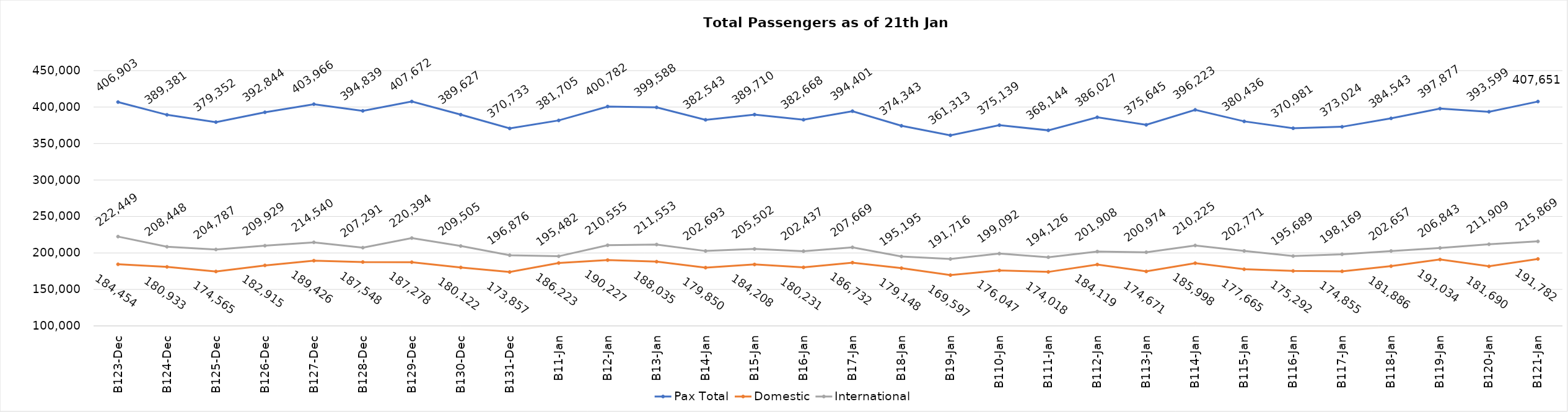
| Category | Pax Total | Domestic | International |
|---|---|---|---|
| 2023-12-23 | 406903 | 184454 | 222449 |
| 2023-12-24 | 389381 | 180933 | 208448 |
| 2023-12-25 | 379352 | 174565 | 204787 |
| 2023-12-26 | 392844 | 182915 | 209929 |
| 2023-12-27 | 403966 | 189426 | 214540 |
| 2023-12-28 | 394839 | 187548 | 207291 |
| 2023-12-29 | 407672 | 187278 | 220394 |
| 2023-12-30 | 389627 | 180122 | 209505 |
| 2023-12-31 | 370733 | 173857 | 196876 |
| 2024-01-01 | 381705 | 186223 | 195482 |
| 2024-01-02 | 400782 | 190227 | 210555 |
| 2024-01-03 | 399588 | 188035 | 211553 |
| 2024-01-04 | 382543 | 179850 | 202693 |
| 2024-01-05 | 389710 | 184208 | 205502 |
| 2024-01-06 | 382668 | 180231 | 202437 |
| 2024-01-07 | 394401 | 186732 | 207669 |
| 2024-01-08 | 374343 | 179148 | 195195 |
| 2024-01-09 | 361313 | 169597 | 191716 |
| 2024-01-10 | 375139 | 176047 | 199092 |
| 2024-01-11 | 368144 | 174018 | 194126 |
| 2024-01-12 | 386027 | 184119 | 201908 |
| 2024-01-13 | 375645 | 174671 | 200974 |
| 2024-01-14 | 396223 | 185998 | 210225 |
| 2024-01-15 | 380436 | 177665 | 202771 |
| 2024-01-16 | 370981 | 175292 | 195689 |
| 2024-01-17 | 373024 | 174855 | 198169 |
| 2024-01-18 | 384543 | 181886 | 202657 |
| 2024-01-19 | 397877 | 191034 | 206843 |
| 2024-01-20 | 393599 | 181690 | 211909 |
| 2024-01-21 | 407651 | 191782 | 215869 |